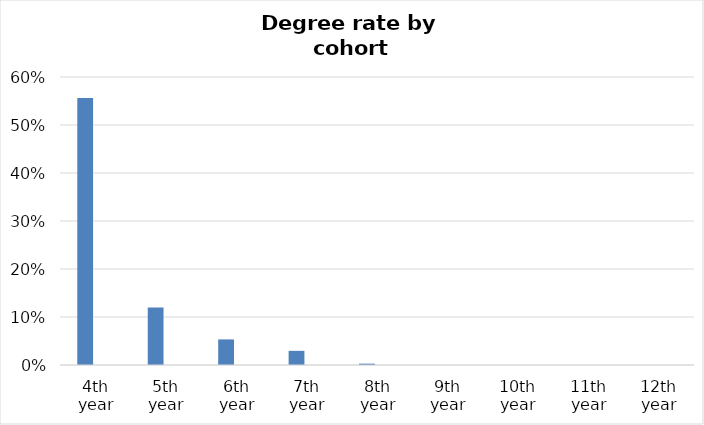
| Category | Series 0 | series2 |
|---|---|---|
| 4th year | 0.556 | 0 |
| 5th year | 0.12 | 0 |
| 6th year | 0.053 | 0 |
| 7th year | 0.029 | 0 |
| 8th year | 0.003 | 0 |
| 9th year | 0 | 0 |
| 10th year | 0 | 0 |
| 11th year | 0 | 0 |
| 12th year | 0 | 0 |